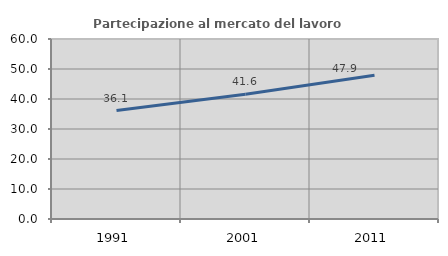
| Category | Partecipazione al mercato del lavoro  femminile |
|---|---|
| 1991.0 | 36.144 |
| 2001.0 | 41.592 |
| 2011.0 | 47.893 |